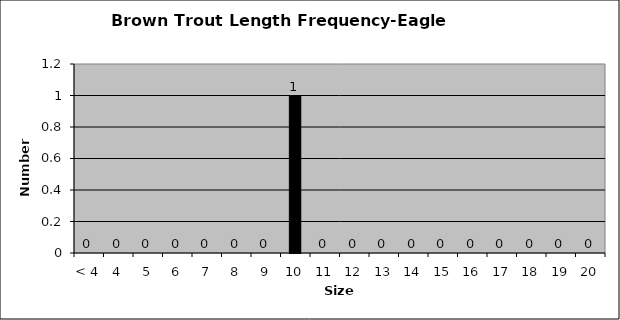
| Category | Series 0 |
|---|---|
| < 4 | 0 |
| 4 | 0 |
| 5 | 0 |
| 6 | 0 |
| 7 | 0 |
| 8 | 0 |
| 9 | 0 |
| 10 | 1 |
| 11 | 0 |
| 12 | 0 |
| 13 | 0 |
| 14 | 0 |
| 15 | 0 |
| 16 | 0 |
| 17 | 0 |
| 18 | 0 |
| 19 | 0 |
| 20 | 0 |